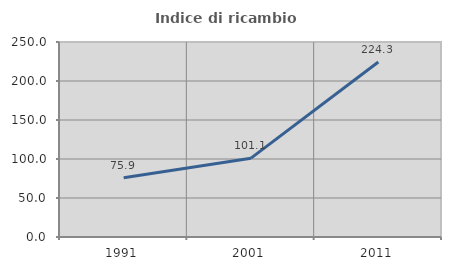
| Category | Indice di ricambio occupazionale  |
|---|---|
| 1991.0 | 75.904 |
| 2001.0 | 101.099 |
| 2011.0 | 224.34 |